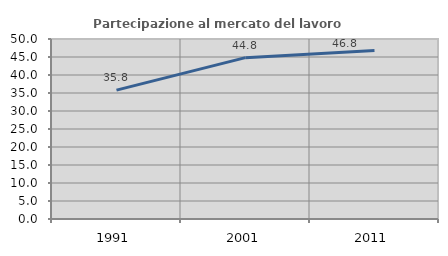
| Category | Partecipazione al mercato del lavoro  femminile |
|---|---|
| 1991.0 | 35.795 |
| 2001.0 | 44.817 |
| 2011.0 | 46.801 |